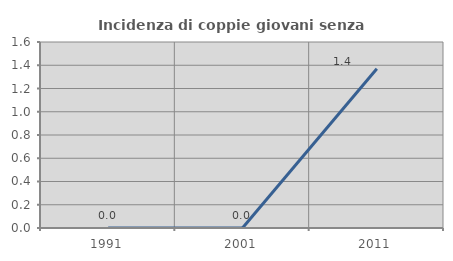
| Category | Incidenza di coppie giovani senza figli |
|---|---|
| 1991.0 | 0 |
| 2001.0 | 0 |
| 2011.0 | 1.37 |